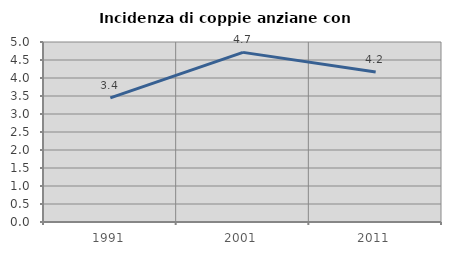
| Category | Incidenza di coppie anziane con figli |
|---|---|
| 1991.0 | 3.448 |
| 2001.0 | 4.712 |
| 2011.0 | 4.167 |